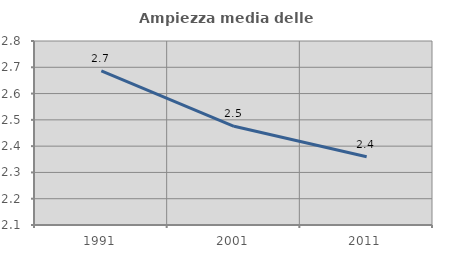
| Category | Ampiezza media delle famiglie |
|---|---|
| 1991.0 | 2.686 |
| 2001.0 | 2.476 |
| 2011.0 | 2.359 |